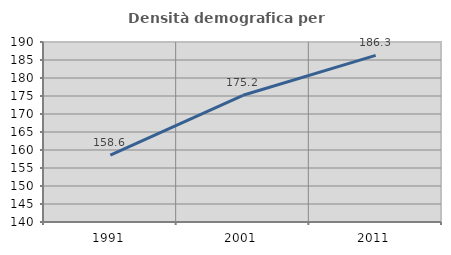
| Category | Densità demografica |
|---|---|
| 1991.0 | 158.598 |
| 2001.0 | 175.203 |
| 2011.0 | 186.273 |